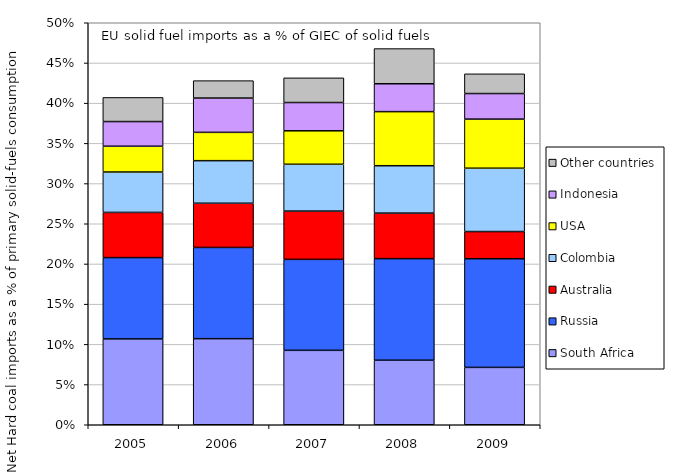
| Category | South Africa | Russia | Australia | Colombia | USA | Indonesia | Other countries |
|---|---|---|---|---|---|---|---|
| 2005.0 | 0.107 | 0.101 | 0.056 | 0.05 | 0.032 | 0.031 | 0.03 |
| 2006.0 | 0.107 | 0.113 | 0.055 | 0.053 | 0.035 | 0.043 | 0.022 |
| 2007.0 | 0.093 | 0.113 | 0.06 | 0.058 | 0.042 | 0.035 | 0.031 |
| 2008.0 | 0.08 | 0.126 | 0.057 | 0.059 | 0.067 | 0.035 | 0.044 |
| 2009.0 | 0.071 | 0.135 | 0.034 | 0.079 | 0.061 | 0.032 | 0.025 |